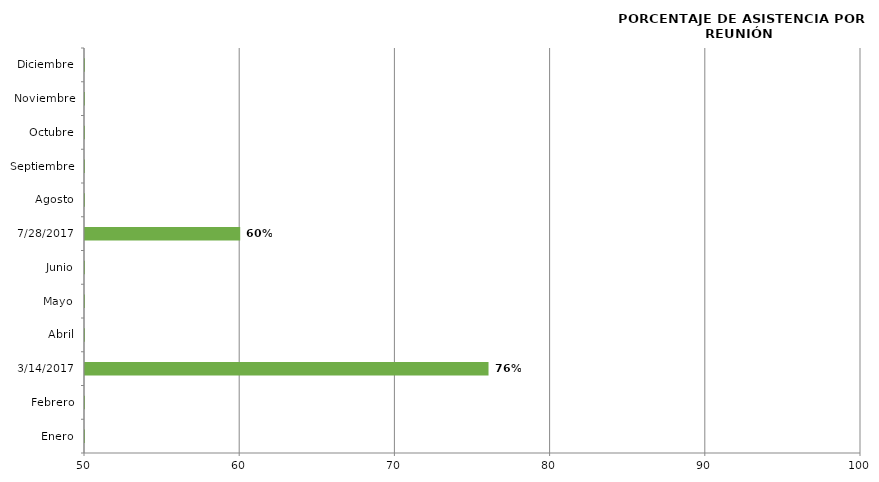
| Category | Series 0 |
|---|---|
| Enero | 0 |
| Febrero | 0 |
| 14/03/2017 | 76 |
| Abril | 0 |
| Mayo | 0 |
| Junio | 0 |
| 28/07/2017 | 60 |
| Agosto | 0 |
| Septiembre | 0 |
| Octubre | 0 |
| Noviembre | 0 |
| Diciembre | 0 |